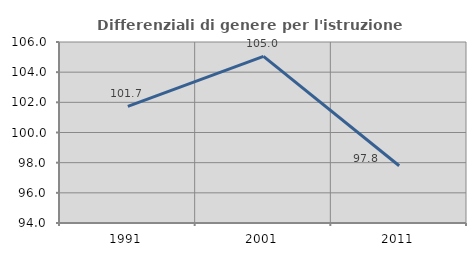
| Category | Differenziali di genere per l'istruzione superiore |
|---|---|
| 1991.0 | 101.727 |
| 2001.0 | 105.05 |
| 2011.0 | 97.794 |